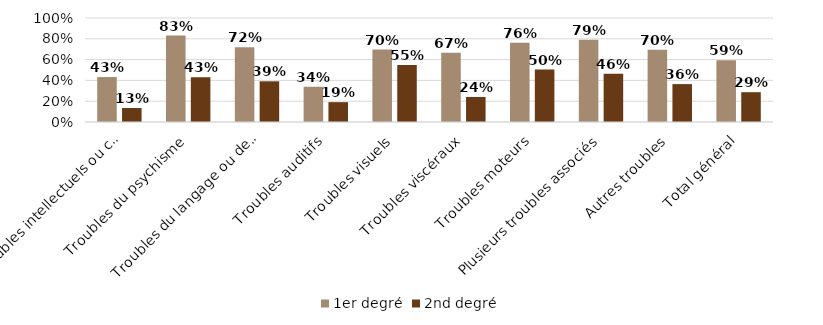
| Category | 1er degré | 2nd degré |
|---|---|---|
| Troubles intellectuels ou cognitifs | 0.432 | 0.135 |
| Troubles du psychisme | 0.831 | 0.43 |
| Troubles du langage ou de la parole | 0.72 | 0.391 |
| Troubles auditifs | 0.339 | 0.191 |
| Troubles visuels | 0.696 | 0.549 |
| Troubles viscéraux | 0.667 | 0.241 |
| Troubles moteurs | 0.763 | 0.505 |
| Plusieurs troubles associés | 0.79 | 0.464 |
| Autres troubles | 0.695 | 0.364 |
| Total général | 0.594 | 0.286 |